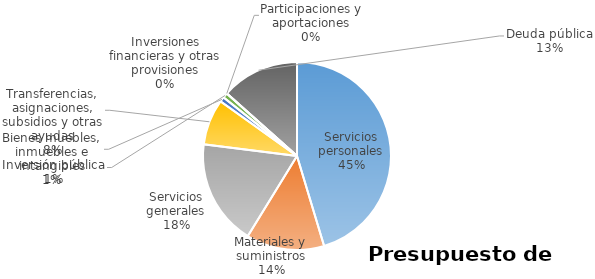
| Category | Series 0 | Series 1 | Series 2 | Series 3 | Series 4 | Series 5 |
|---|---|---|---|---|---|---|
| Servicios personales | 31464104 |  |  |  |  |  |
| Materiales y suministros | 9316300 |  |  |  |  |  |
| Servicios generales | 12641095 |  |  |  |  |  |
| Transferencias, asignaciones, subsidios y otras ayudas | 5478624 |  |  |  |  |  |
| Bienes muebles, inmuebles e intangibles | 581100 |  |  |  |  |  |
| Inversión pública | 600000 |  |  |  |  |  |
| Inversiones financieras y otras provisiones | 0 |  |  |  |  |  |
| Participaciones y aportaciones | 0 |  |  |  |  |  |
| Deuda pública | 9314341 |  |  |  |  |  |